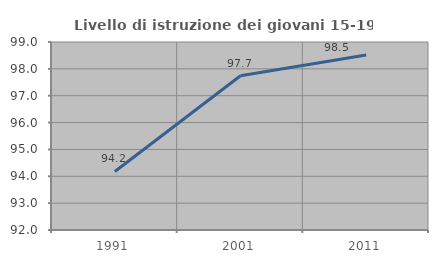
| Category | Livello di istruzione dei giovani 15-19 anni |
|---|---|
| 1991.0 | 94.18 |
| 2001.0 | 97.744 |
| 2011.0 | 98.519 |